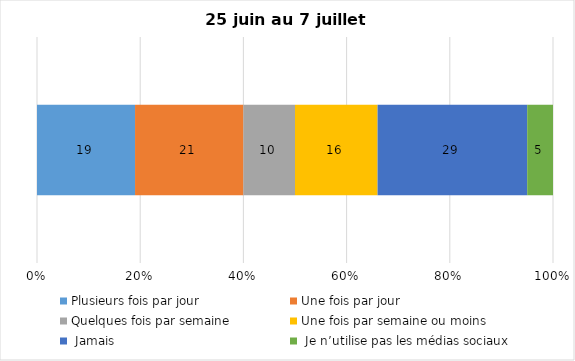
| Category | Plusieurs fois par jour | Une fois par jour | Quelques fois par semaine   | Une fois par semaine ou moins   |  Jamais   |  Je n’utilise pas les médias sociaux |
|---|---|---|---|---|---|---|
| 0 | 19 | 21 | 10 | 16 | 29 | 5 |